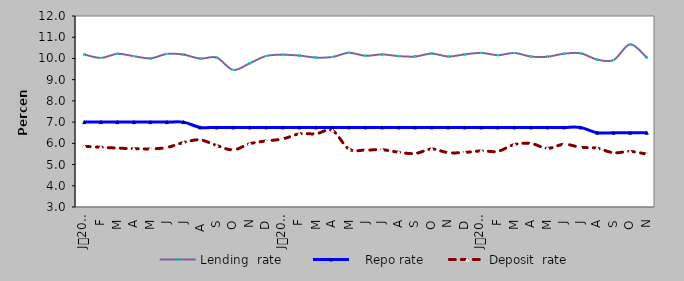
| Category | Lending  rate |    Repo rate | Deposit  rate |
|---|---|---|---|
| 0 | 10.187 | 7 | 5.858 |
| 1900-01-01 | 10.024 | 7 | 5.815 |
| 1900-01-02 | 10.218 | 7 | 5.776 |
| 1900-01-03 | 10.107 | 7 | 5.746 |
| 1900-01-04 | 10.004 | 7 | 5.74 |
| 1900-01-05 | 10.214 | 7 | 5.804 |
| 1900-01-06 | 10.18 | 7 | 6.04 |
| 1900-01-07 | 9.994 | 6.75 | 6.162 |
| 1900-01-08 | 10.042 | 6.75 | 5.898 |
| 1900-01-09 | 9.46 | 6.75 | 5.69 |
| 1900-01-10 | 9.774 | 6.75 | 5.98 |
| 1900-01-11 | 10.117 | 6.75 | 6.113 |
| 1900-01-12 | 10.174 | 6.75 | 6.207 |
| 1900-01-13 | 10.136 | 6.75 | 6.446 |
| 1900-01-14 | 10.04 | 6.75 | 6.45 |
| 1900-01-15 | 10.07 | 6.75 | 6.6 |
| 1900-01-16 | 10.265 | 6.75 | 5.728 |
| 1900-01-17 | 10.125 | 6.75 | 5.682 |
| 1900-01-18 | 10.19 | 6.75 | 5.7 |
| 1900-01-19 | 10.11 | 6.75 | 5.58 |
| 1900-01-20 | 10.09 | 6.75 | 5.52 |
| 1900-01-21 | 10.23 | 6.75 | 5.73 |
| 1900-01-22 | 10.09 | 6.75 | 5.56 |
| 1900-01-23 | 10.192 | 6.75 | 5.572 |
| 1900-01-24 | 10.261 | 6.75 | 5.643 |
| 1900-01-25 | 10.155 | 6.75 | 5.624 |
| 1900-01-26 | 10.257 | 6.75 | 5.943 |
| 1900-01-27 | 10.09 | 6.75 | 5.994 |
| 1900-01-28 | 10.081 | 6.75 | 5.764 |
| 1900-01-29 | 10.224 | 6.75 | 5.956 |
| 1900-01-30 | 10.245 | 6.75 | 5.813 |
| 1900-01-31 | 9.948 | 6.5 | 5.769 |
| 1900-02-01 | 9.925 | 6.5 | 5.555 |
| 1900-02-02 | 10.666 | 6.5 | 5.616 |
| 1900-02-03 | 10.04 | 6.5 | 5.49 |